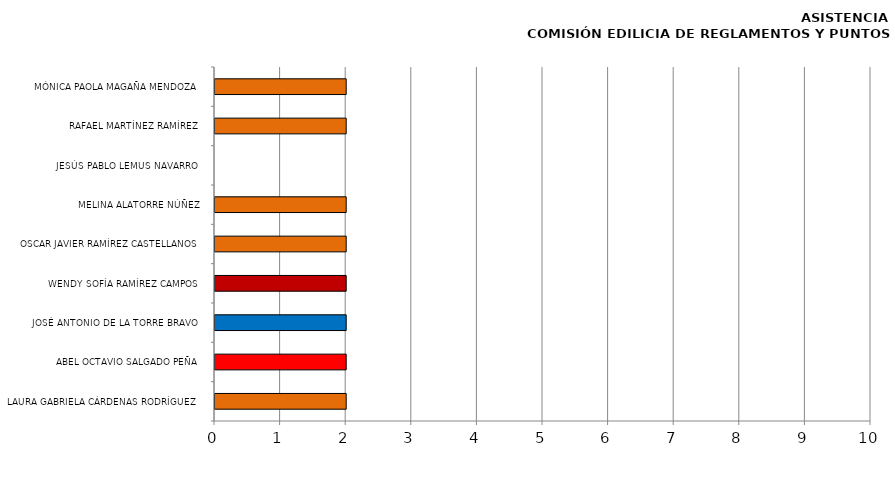
| Category | Series 0 |
|---|---|
| LAURA GABRIELA CÁRDENAS RODRÍGUEZ | 2 |
| ABEL OCTAVIO SALGADO PEÑA | 2 |
| JOSÉ ANTONIO DE LA TORRE BRAVO | 2 |
| WENDY SOFÍA RAMÍREZ CAMPOS | 2 |
| OSCAR JAVIER RAMÍREZ CASTELLANOS | 2 |
| MELINA ALATORRE NÚÑEZ | 2 |
| JESÚS PABLO LEMUS NAVARRO | 0 |
| RAFAEL MARTÍNEZ RAMÍREZ | 2 |
| MÓNICA PAOLA MAGAÑA MENDOZA | 2 |